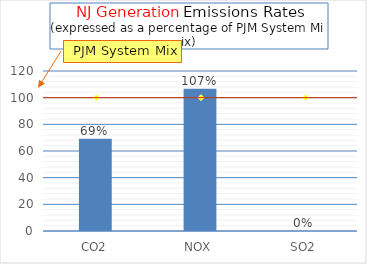
| Category | NJ Generation (%)  |
|---|---|
| CO2 | 69.159 |
| NOX | 106.639 |
| SO2 | 0 |